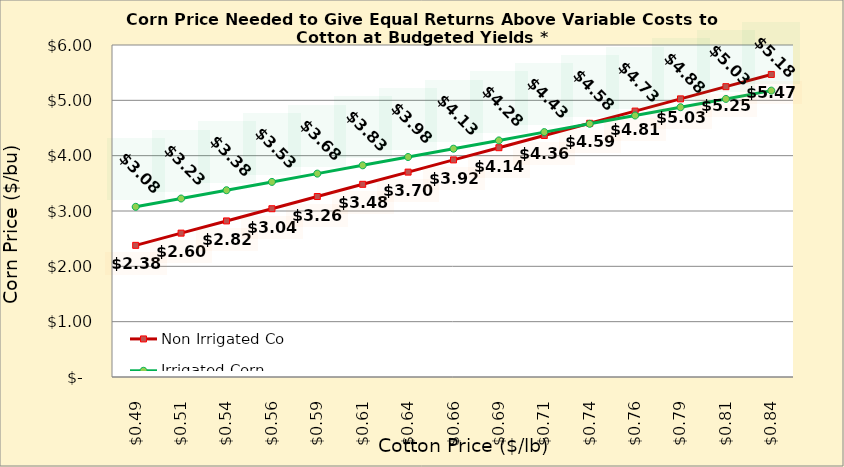
| Category | Non Irrigated Corn | Irrigated Corn |
|---|---|---|
| 0.4849999999999999 | 2.379 | 3.076 |
| 0.5099999999999999 | 2.6 | 3.226 |
| 0.5349999999999999 | 2.82 | 3.376 |
| 0.5599999999999999 | 3.041 | 3.526 |
| 0.585 | 3.262 | 3.676 |
| 0.61 | 3.482 | 3.826 |
| 0.635 | 3.703 | 3.976 |
| 0.66 | 3.923 | 4.126 |
| 0.685 | 4.144 | 4.276 |
| 0.7100000000000001 | 4.365 | 4.426 |
| 0.7350000000000001 | 4.585 | 4.576 |
| 0.7600000000000001 | 4.806 | 4.726 |
| 0.7850000000000001 | 5.026 | 4.876 |
| 0.8100000000000002 | 5.247 | 5.026 |
| 0.8350000000000002 | 5.468 | 5.176 |